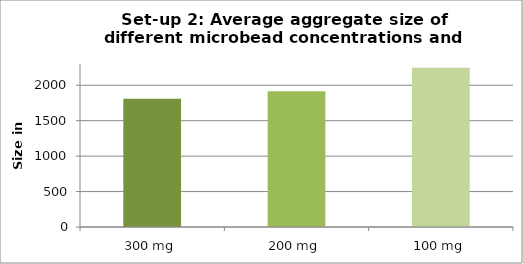
| Category | Series 0 |
|---|---|
| 300 mg | 1809.541 |
| 200 mg | 1915.417 |
| 100 mg | 2247.923 |